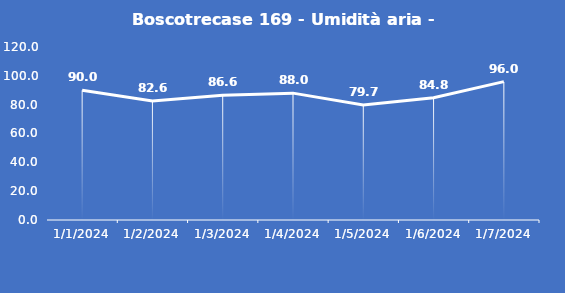
| Category | Boscotrecase 169 - Umidità aria - Grezzo (%) |
|---|---|
| 1/1/24 | 90 |
| 1/2/24 | 82.6 |
| 1/3/24 | 86.6 |
| 1/4/24 | 88 |
| 1/5/24 | 79.7 |
| 1/6/24 | 84.8 |
| 1/7/24 | 96 |